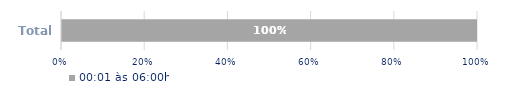
| Category | 00:01 às 06:00h |
|---|---|
| Total | 1 |